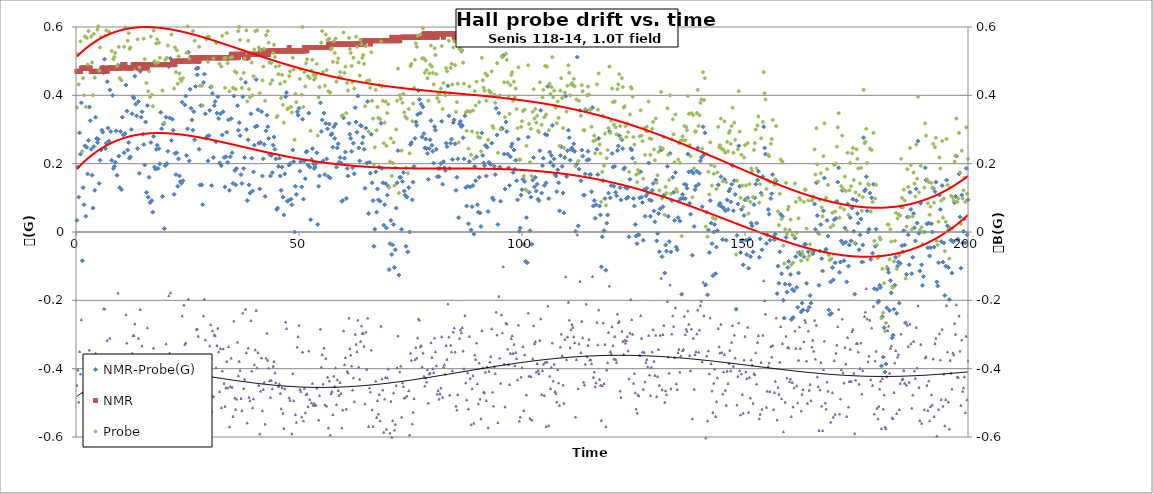
| Category | NMR-Probe(G) |
|---|---|
| 0.2 | 0.034 |
| 0.4 | 0.19 |
| 0.6000000000000001 | 0.102 |
| 0.8 | 0.29 |
| 1.0 | 0.228 |
| 1.2 | 0.378 |
| 1.4 | -0.084 |
| 1.5999999999999999 | 0.13 |
| 1.7999999999999998 | 0.08 |
| 1.9999999999999998 | 0.252 |
| 2.1999999999999997 | 0.046 |
| 2.4 | 0.248 |
| 2.6 | 0.17 |
| 2.8000000000000003 | 0.268 |
| 3.0000000000000004 | 0.366 |
| 3.2000000000000006 | 0.326 |
| 3.400000000000001 | 0.242 |
| 3.600000000000001 | 0.166 |
| 3.800000000000001 | 0.07 |
| 4.000000000000001 | 0.25 |
| 4.200000000000001 | 0.122 |
| 4.400000000000001 | 0.336 |
| 4.600000000000001 | 0.274 |
| 4.800000000000002 | 0.262 |
| 5.000000000000002 | 0.272 |
| 5.200000000000002 | 0.142 |
| 5.400000000000002 | 0.21 |
| 5.600000000000002 | 0.24 |
| 5.8000000000000025 | 0.298 |
| 6.000000000000003 | 0.292 |
| 6.200000000000003 | 0.466 |
| 6.400000000000003 | 0.506 |
| 6.600000000000003 | 0.244 |
| 6.800000000000003 | 0.26 |
| 7.0000000000000036 | 0.44 |
| 7.200000000000004 | 0.304 |
| 7.400000000000004 | 0.266 |
| 7.600000000000004 | 0.416 |
| 7.800000000000004 | 0.294 |
| 8.000000000000004 | 0.21 |
| 8.200000000000003 | 0.4 |
| 8.400000000000002 | 0.186 |
| 8.600000000000001 | 0.192 |
| 8.8 | 0.204 |
| 9.0 | 0.296 |
| 9.2 | 0.166 |
| 9.399999999999999 | 0.488 |
| 9.599999999999998 | 0.222 |
| 9.799999999999997 | 0.13 |
| 9.999999999999996 | 0.294 |
| 10.199999999999996 | 0.124 |
| 10.399999999999995 | 0.336 |
| 10.599999999999994 | 0.284 |
| 10.799999999999994 | 0.232 |
| 10.999999999999993 | 0.288 |
| 11.199999999999992 | 0.43 |
| 11.399999999999991 | 0.354 |
| 11.59999999999999 | 0.24 |
| 11.79999999999999 | 0.262 |
| 11.99999999999999 | 0.216 |
| 12.199999999999989 | 0.22 |
| 12.399999999999988 | 0.3 |
| 12.599999999999987 | 0.346 |
| 12.799999999999986 | 0.396 |
| 12.999999999999986 | 0.392 |
| 13.199999999999985 | 0.456 |
| 13.399999999999984 | 0.374 |
| 13.599999999999984 | 0.34 |
| 13.799999999999983 | 0.244 |
| 13.999999999999982 | 0.382 |
| 14.199999999999982 | 0.172 |
| 14.39999999999998 | 0.47 |
| 14.59999999999998 | 0.336 |
| 14.79999999999998 | 0.352 |
| 14.999999999999979 | 0.286 |
| 15.199999999999978 | 0.256 |
| 15.399999999999977 | 0.196 |
| 15.599999999999977 | 0.322 |
| 15.799999999999976 | 0.116 |
| 15.999999999999975 | 0.37 |
| 16.199999999999974 | 0.102 |
| 16.399999999999974 | 0.16 |
| 16.599999999999973 | 0.086 |
| 16.799999999999972 | 0.262 |
| 16.99999999999997 | 0.092 |
| 17.19999999999997 | 0.058 |
| 17.39999999999997 | 0.28 |
| 17.59999999999997 | 0.19 |
| 17.79999999999997 | 0.184 |
| 17.999999999999968 | 0.242 |
| 18.199999999999967 | 0.254 |
| 18.399999999999967 | 0.186 |
| 18.599999999999966 | 0.244 |
| 18.799999999999965 | 0.2 |
| 18.999999999999964 | 0.35 |
| 19.199999999999964 | 0.302 |
| 19.399999999999963 | 0.104 |
| 19.599999999999962 | 0.316 |
| 19.79999999999996 | 0.01 |
| 19.99999999999996 | 0.194 |
| 20.19999999999996 | 0.336 |
| 20.39999999999996 | 0.2 |
| 20.59999999999996 | 0.236 |
| 20.799999999999958 | 0.484 |
| 20.999999999999957 | 0.334 |
| 21.199999999999957 | 0.508 |
| 21.399999999999956 | 0.268 |
| 21.599999999999955 | 0.33 |
| 21.799999999999955 | 0.298 |
| 21.999999999999954 | 0.11 |
| 22.199999999999953 | 0.23 |
| 22.399999999999952 | 0.168 |
| 22.59999999999995 | 0.232 |
| 22.79999999999995 | 0.134 |
| 22.99999999999995 | 0.214 |
| 23.19999999999995 | 0.164 |
| 23.39999999999995 | 0.148 |
| 23.599999999999948 | 0.142 |
| 23.799999999999947 | 0.38 |
| 23.999999999999947 | 0.15 |
| 24.199999999999946 | 0.498 |
| 24.399999999999945 | 0.372 |
| 24.599999999999945 | 0.398 |
| 24.799999999999944 | 0.224 |
| 24.999999999999943 | 0.302 |
| 25.199999999999942 | 0.526 |
| 25.39999999999994 | 0.208 |
| 25.59999999999994 | 0.418 |
| 25.79999999999994 | 0.362 |
| 25.99999999999994 | 0.328 |
| 26.19999999999994 | 0.298 |
| 26.399999999999938 | 0.352 |
| 26.599999999999937 | 0.27 |
| 26.799999999999937 | 0.426 |
| 26.999999999999936 | 0.478 |
| 27.199999999999935 | 0.46 |
| 27.399999999999935 | 0.48 |
| 27.599999999999934 | 0.242 |
| 27.799999999999933 | 0.138 |
| 27.999999999999932 | 0.37 |
| 28.199999999999932 | 0.138 |
| 28.39999999999993 | 0.08 |
| 28.59999999999993 | 0.438 |
| 28.79999999999993 | 0.462 |
| 28.99999999999993 | 0.346 |
| 29.19999999999993 | 0.274 |
| 29.399999999999928 | 0.28 |
| 29.599999999999927 | 0.208 |
| 29.799999999999926 | 0.282 |
| 29.999999999999925 | 0.356 |
| 30.199999999999925 | 0.424 |
| 30.399999999999924 | 0.136 |
| 30.599999999999923 | 0.406 |
| 30.799999999999923 | 0.218 |
| 30.999999999999922 | 0.37 |
| 31.19999999999992 | 0.382 |
| 31.39999999999992 | 0.264 |
| 31.59999999999992 | 0.348 |
| 31.79999999999992 | 0.396 |
| 31.99999999999992 | 0.332 |
| 32.19999999999992 | 0.202 |
| 32.39999999999992 | 0.346 |
| 32.59999999999992 | 0.194 |
| 32.799999999999926 | 0.284 |
| 32.99999999999993 | 0.352 |
| 33.19999999999993 | 0.218 |
| 33.399999999999935 | 0.132 |
| 33.59999999999994 | 0.22 |
| 33.79999999999994 | 0.292 |
| 33.99999999999994 | 0.204 |
| 34.199999999999946 | 0.328 |
| 34.39999999999995 | 0.122 |
| 34.59999999999995 | 0.22 |
| 34.799999999999955 | 0.332 |
| 34.99999999999996 | 0.232 |
| 35.19999999999996 | 0.142 |
| 35.39999999999996 | 0.398 |
| 35.599999999999966 | 0.18 |
| 35.79999999999997 | 0.138 |
| 35.99999999999997 | 0.186 |
| 36.199999999999974 | 0.37 |
| 36.39999999999998 | 0.298 |
| 36.59999999999998 | 0.32 |
| 36.79999999999998 | 0.282 |
| 36.999999999999986 | 0.168 |
| 37.19999999999999 | 0.142 |
| 37.39999999999999 | 0.396 |
| 37.599999999999994 | 0.186 |
| 37.8 | 0.218 |
| 38.0 | 0.438 |
| 38.2 | 0.3 |
| 38.400000000000006 | 0.092 |
| 38.60000000000001 | 0.27 |
| 38.80000000000001 | 0.138 |
| 39.000000000000014 | 0.114 |
| 39.20000000000002 | 0.346 |
| 39.40000000000002 | 0.216 |
| 39.60000000000002 | 0.12 |
| 39.800000000000026 | 0.176 |
| 40.00000000000003 | 0.254 |
| 40.20000000000003 | 0.308 |
| 40.400000000000034 | 0.446 |
| 40.60000000000004 | 0.31 |
| 40.80000000000004 | 0.358 |
| 41.00000000000004 | 0.26 |
| 41.200000000000045 | 0.126 |
| 41.40000000000005 | 0.262 |
| 41.60000000000005 | 0.352 |
| 41.800000000000054 | 0.164 |
| 42.00000000000006 | 0.214 |
| 42.20000000000006 | 0.256 |
| 42.40000000000006 | 0.104 |
| 42.600000000000065 | 0.296 |
| 42.80000000000007 | 0.342 |
| 43.00000000000007 | 0.308 |
| 43.200000000000074 | 0.274 |
| 43.40000000000008 | 0.226 |
| 43.60000000000008 | 0.164 |
| 43.80000000000008 | 0.224 |
| 44.000000000000085 | 0.174 |
| 44.20000000000009 | 0.254 |
| 44.40000000000009 | 0.278 |
| 44.600000000000094 | 0.242 |
| 44.8000000000001 | 0.214 |
| 45.0000000000001 | 0.066 |
| 45.2000000000001 | 0.07 |
| 45.400000000000105 | 0.192 |
| 45.60000000000011 | 0.216 |
| 45.80000000000011 | 0.164 |
| 46.000000000000114 | 0.122 |
| 46.20000000000012 | 0.19 |
| 46.40000000000012 | 0.102 |
| 46.60000000000012 | 0.05 |
| 46.800000000000125 | 0.17 |
| 47.00000000000013 | 0.396 |
| 47.20000000000013 | 0.408 |
| 47.400000000000134 | 0.09 |
| 47.600000000000136 | 0.092 |
| 47.80000000000014 | 0.196 |
| 48.00000000000014 | 0.2 |
| 48.200000000000145 | 0.096 |
| 48.40000000000015 | 0.08 |
| 48.60000000000015 | 0.24 |
| 48.80000000000015 | 0.206 |
| 49.000000000000156 | 0 |
| 49.20000000000016 | 0.134 |
| 49.40000000000016 | 0.11 |
| 49.600000000000165 | 0.352 |
| 49.80000000000017 | 0.342 |
| 50.00000000000017 | 0.362 |
| 50.20000000000017 | 0.178 |
| 50.400000000000176 | 0.206 |
| 50.60000000000018 | 0.132 |
| 50.80000000000018 | 0.33 |
| 51.000000000000185 | 0.096 |
| 51.20000000000019 | 0.208 |
| 51.40000000000019 | 0.156 |
| 51.60000000000019 | 0.234 |
| 51.800000000000196 | 0.236 |
| 52.0000000000002 | 0.196 |
| 52.2000000000002 | 0.348 |
| 52.400000000000205 | 0.19 |
| 52.60000000000021 | 0.036 |
| 52.80000000000021 | 0.212 |
| 53.00000000000021 | 0.244 |
| 53.200000000000216 | 0.2 |
| 53.40000000000022 | 0.186 |
| 53.60000000000022 | 0.19 |
| 53.800000000000225 | 0.2 |
| 54.00000000000023 | 0.232 |
| 54.20000000000023 | 0.022 |
| 54.40000000000023 | 0.134 |
| 54.600000000000236 | 0.164 |
| 54.80000000000024 | 0.378 |
| 55.00000000000024 | 0.294 |
| 55.200000000000244 | 0.328 |
| 55.40000000000025 | 0.208 |
| 55.60000000000025 | 0.348 |
| 55.80000000000025 | 0.168 |
| 56.000000000000256 | 0.318 |
| 56.20000000000026 | 0.214 |
| 56.40000000000026 | 0.302 |
| 56.600000000000264 | 0.162 |
| 56.80000000000027 | 0.316 |
| 57.00000000000027 | 0.158 |
| 57.20000000000027 | 0.284 |
| 57.400000000000276 | 0.288 |
| 57.60000000000028 | 0.248 |
| 57.80000000000028 | 0.308 |
| 58.000000000000284 | 0.274 |
| 58.20000000000029 | 0.316 |
| 58.40000000000029 | 0.19 |
| 58.60000000000029 | 0.246 |
| 58.800000000000296 | 0.258 |
| 59.0000000000003 | 0.204 |
| 59.2000000000003 | 0.218 |
| 59.400000000000304 | 0.202 |
| 59.60000000000031 | 0.09 |
| 59.80000000000031 | 0.092 |
| 60.00000000000031 | 0.334 |
| 60.200000000000315 | 0.216 |
| 60.40000000000032 | 0.234 |
| 60.60000000000032 | 0.098 |
| 60.800000000000324 | 0.186 |
| 61.00000000000033 | 0.164 |
| 61.20000000000033 | 0.318 |
| 61.40000000000033 | 0.286 |
| 61.600000000000335 | 0.274 |
| 61.80000000000034 | 0.236 |
| 62.00000000000034 | 0.188 |
| 62.200000000000344 | 0.26 |
| 62.40000000000035 | 0.17 |
| 62.60000000000035 | 0.364 |
| 62.80000000000035 | 0.322 |
| 63.000000000000355 | 0.292 |
| 63.20000000000036 | 0.398 |
| 63.40000000000036 | 0.246 |
| 63.600000000000364 | 0.208 |
| 63.80000000000037 | 0.312 |
| 64.00000000000037 | 0.31 |
| 64.20000000000037 | 0.26 |
| 64.40000000000038 | 0.278 |
| 64.60000000000038 | 0.242 |
| 64.80000000000038 | 0.128 |
| 65.00000000000038 | 0.304 |
| 65.20000000000039 | 0.202 |
| 65.40000000000039 | 0.382 |
| 65.60000000000039 | 0.054 |
| 65.8000000000004 | 0.204 |
| 66.0000000000004 | 0.172 |
| 66.2000000000004 | 0.286 |
| 66.4000000000004 | 0.144 |
| 66.6000000000004 | 0.092 |
| 66.80000000000041 | -0.042 |
| 67.00000000000041 | 0.008 |
| 67.20000000000041 | 0.176 |
| 67.40000000000042 | 0.058 |
| 67.60000000000042 | 0.126 |
| 67.80000000000042 | 0.094 |
| 68.00000000000043 | 0.19 |
| 68.20000000000043 | 0.09 |
| 68.40000000000043 | 0.318 |
| 68.60000000000043 | 0.186 |
| 68.80000000000044 | 0.144 |
| 69.00000000000044 | 0.02 |
| 69.20000000000044 | 0.08 |
| 69.40000000000045 | 0.142 |
| 69.60000000000045 | 0.012 |
| 69.80000000000045 | 0.108 |
| 70.00000000000045 | 0.134 |
| 70.20000000000046 | -0.11 |
| 70.40000000000046 | -0.034 |
| 70.60000000000046 | 0.034 |
| 70.80000000000047 | -0.066 |
| 71.00000000000047 | -0.038 |
| 71.20000000000047 | 0.022 |
| 71.40000000000047 | -0.104 |
| 71.60000000000048 | -0.052 |
| 71.80000000000048 | 0.07 |
| 72.00000000000048 | 0.144 |
| 72.20000000000049 | 0.238 |
| 72.40000000000049 | -0.126 |
| 72.60000000000049 | 0.16 |
| 72.8000000000005 | 0.16 |
| 73.0000000000005 | 0.008 |
| 73.2000000000005 | 0.148 |
| 73.4000000000005 | 0.174 |
| 73.6000000000005 | 0.12 |
| 73.80000000000051 | 0.108 |
| 74.00000000000051 | -0.042 |
| 74.20000000000051 | 0.102 |
| 74.40000000000052 | -0.058 |
| 74.60000000000052 | 0.13 |
| 74.80000000000052 | 0 |
| 75.00000000000053 | 0.256 |
| 75.20000000000053 | 0.262 |
| 75.40000000000053 | 0.094 |
| 75.60000000000053 | 0.146 |
| 75.80000000000054 | 0.192 |
| 76.00000000000054 | 0.274 |
| 76.20000000000054 | 0.322 |
| 76.40000000000055 | 0.312 |
| 76.60000000000055 | 0.344 |
| 76.80000000000055 | 0.414 |
| 77.00000000000055 | 0.388 |
| 77.20000000000056 | 0.348 |
| 77.40000000000056 | 0.374 |
| 77.60000000000056 | 0.278 |
| 77.80000000000057 | 0.366 |
| 78.00000000000057 | 0.288 |
| 78.20000000000057 | 0.246 |
| 78.40000000000057 | 0.272 |
| 78.60000000000058 | 0.244 |
| 78.80000000000058 | 0.23 |
| 79.00000000000058 | 0.154 |
| 79.20000000000059 | 0.244 |
| 79.40000000000059 | 0.27 |
| 79.60000000000059 | 0.326 |
| 79.8000000000006 | 0.254 |
| 80.0000000000006 | 0.236 |
| 80.2000000000006 | 0.202 |
| 80.4000000000006 | 0.308 |
| 80.6000000000006 | 0.298 |
| 80.80000000000061 | 0.242 |
| 81.00000000000061 | 0.162 |
| 81.20000000000061 | 0.186 |
| 81.40000000000062 | 0.162 |
| 81.60000000000062 | 0.186 |
| 81.80000000000062 | 0.2 |
| 82.00000000000063 | 0.324 |
| 82.20000000000063 | 0.14 |
| 82.40000000000063 | 0.206 |
| 82.60000000000063 | 0.188 |
| 82.80000000000064 | 0.18 |
| 83.00000000000064 | 0.26 |
| 83.20000000000064 | 0.25 |
| 83.40000000000065 | 0.428 |
| 83.60000000000065 | 0.34 |
| 83.80000000000065 | 0.186 |
| 84.00000000000065 | 0.26 |
| 84.20000000000066 | 0.272 |
| 84.40000000000066 | 0.212 |
| 84.60000000000066 | 0.32 |
| 84.80000000000067 | 0.328 |
| 85.00000000000067 | 0.258 |
| 85.20000000000067 | 0.122 |
| 85.40000000000067 | 0.16 |
| 85.60000000000068 | 0.214 |
| 85.80000000000068 | 0.042 |
| 86.00000000000068 | 0.316 |
| 86.20000000000068 | 0.324 |
| 86.40000000000069 | 0.308 |
| 86.60000000000069 | 0.312 |
| 86.8000000000007 | 0.276 |
| 87.0000000000007 | 0.214 |
| 87.2000000000007 | 0.34 |
| 87.4000000000007 | 0.13 |
| 87.6000000000007 | 0.076 |
| 87.80000000000071 | 0.134 |
| 88.00000000000071 | 0.024 |
| 88.20000000000071 | 0.206 |
| 88.40000000000072 | 0.132 |
| 88.60000000000072 | 0.006 |
| 88.80000000000072 | 0.074 |
| 89.00000000000072 | 0.136 |
| 89.20000000000073 | -0.006 |
| 89.40000000000073 | 0.192 |
| 89.60000000000073 | 0.15 |
| 89.80000000000074 | 0.22 |
| 90.00000000000074 | 0.08 |
| 90.20000000000074 | 0.058 |
| 90.40000000000074 | 0.16 |
| 90.60000000000075 | 0.056 |
| 90.80000000000075 | 0.016 |
| 91.00000000000075 | 0.29 |
| 91.20000000000076 | 0.224 |
| 91.40000000000076 | 0.202 |
| 91.60000000000076 | 0.194 |
| 91.80000000000076 | 0.254 |
| 92.00000000000077 | 0.164 |
| 92.20000000000077 | 0.248 |
| 92.40000000000077 | 0.06 |
| 92.60000000000078 | 0.204 |
| 92.80000000000078 | 0.2 |
| 93.00000000000078 | 0.198 |
| 93.20000000000078 | 0.26 |
| 93.40000000000079 | 0.1 |
| 93.60000000000079 | 0.094 |
| 93.8000000000008 | 0.192 |
| 94.0000000000008 | 0.168 |
| 94.2000000000008 | 0.362 |
| 94.4000000000008 | 0.284 |
| 94.6000000000008 | 0.022 |
| 94.80000000000081 | 0.348 |
| 95.00000000000081 | 0.19 |
| 95.20000000000081 | 0.09 |
| 95.40000000000082 | 0.304 |
| 95.60000000000082 | 0.302 |
| 95.80000000000082 | 0.516 |
| 96.00000000000082 | 0.228 |
| 96.20000000000083 | 0.126 |
| 96.40000000000083 | 0.322 |
| 96.60000000000083 | 0.294 |
| 96.80000000000084 | 0.228 |
| 97.00000000000084 | 0.188 |
| 97.20000000000084 | 0.136 |
| 97.40000000000084 | 0.22 |
| 97.60000000000085 | 0.25 |
| 97.80000000000085 | 0.258 |
| 98.00000000000085 | 0.174 |
| 98.20000000000086 | 0.24 |
| 98.40000000000086 | 0.184 |
| 98.60000000000086 | 0.21 |
| 98.80000000000086 | 0.15 |
| 99.00000000000087 | 0.094 |
| 99.20000000000087 | 0.272 |
| 99.40000000000087 | 0.002 |
| 99.60000000000088 | 0.012 |
| 99.80000000000088 | 0.108 |
| 100.00000000000088 | 0.124 |
| 100.20000000000088 | 0.154 |
| 100.40000000000089 | -0.036 |
| 100.60000000000089 | 0.148 |
| 100.80000000000089 | -0.086 |
| 101.0000000000009 | 0.042 |
| 101.2000000000009 | -0.09 |
| 101.4000000000009 | 0.278 |
| 101.6000000000009 | 0.116 |
| 101.8000000000009 | 0.004 |
| 102.00000000000091 | 0.102 |
| 102.20000000000091 | -0.036 |
| 102.40000000000092 | 0.152 |
| 102.60000000000092 | 0.218 |
| 102.80000000000092 | 0.132 |
| 103.00000000000092 | 0.16 |
| 103.20000000000093 | 0.12 |
| 103.40000000000093 | 0.14 |
| 103.60000000000093 | 0.096 |
| 103.80000000000094 | 0.092 |
| 104.00000000000094 | 0.238 |
| 104.20000000000094 | 0.356 |
| 104.40000000000094 | 0.114 |
| 104.60000000000095 | 0.194 |
| 104.80000000000095 | 0.216 |
| 105.00000000000095 | 0.136 |
| 105.20000000000095 | 0.286 |
| 105.40000000000096 | 0.144 |
| 105.60000000000096 | 0.284 |
| 105.80000000000096 | 0.426 |
| 106.00000000000097 | 0.098 |
| 106.20000000000097 | 0.234 |
| 106.40000000000097 | 0.204 |
| 106.60000000000097 | 0.224 |
| 106.80000000000098 | 0.312 |
| 107.00000000000098 | 0.194 |
| 107.20000000000098 | 0.214 |
| 107.40000000000099 | 0.168 |
| 107.60000000000099 | 0.164 |
| 107.80000000000099 | 0.118 |
| 108.000000000001 | 0.182 |
| 108.200000000001 | 0.144 |
| 108.400000000001 | 0.062 |
| 108.600000000001 | 0.224 |
| 108.800000000001 | 0.25 |
| 109.00000000000101 | 0.192 |
| 109.20000000000101 | 0.114 |
| 109.40000000000101 | 0.056 |
| 109.60000000000102 | 0.218 |
| 109.80000000000102 | 0.398 |
| 110.00000000000102 | 0.162 |
| 110.20000000000103 | 0.238 |
| 110.40000000000103 | 0.298 |
| 110.60000000000103 | 0.276 |
| 110.80000000000103 | 0.21 |
| 111.00000000000104 | 0.242 |
| 111.20000000000104 | 0.246 |
| 111.40000000000104 | 0.24 |
| 111.60000000000105 | 0.258 |
| 111.80000000000105 | 0.236 |
| 112.00000000000105 | 0.002 |
| 112.20000000000105 | 0.198 |
| 112.40000000000106 | 0.512 |
| 112.60000000000106 | 0.018 |
| 112.80000000000106 | 0.184 |
| 113.00000000000107 | 0.356 |
| 113.20000000000107 | 0.15 |
| 113.40000000000107 | 0.24 |
| 113.60000000000107 | 0.222 |
| 113.80000000000108 | 0.108 |
| 114.00000000000108 | 0.108 |
| 114.20000000000108 | 0.17 |
| 114.40000000000109 | 0.356 |
| 114.60000000000109 | 0.21 |
| 114.80000000000109 | 0.236 |
| 115.0000000000011 | 0.212 |
| 115.2000000000011 | 0.168 |
| 115.4000000000011 | 0.168 |
| 115.6000000000011 | 0.118 |
| 115.8000000000011 | 0.364 |
| 116.00000000000111 | 0.076 |
| 116.20000000000111 | 0.092 |
| 116.40000000000111 | 0.04 |
| 116.60000000000112 | 0.08 |
| 116.80000000000112 | 0.242 |
| 117.00000000000112 | 0.168 |
| 117.20000000000113 | 0.274 |
| 117.40000000000113 | 0.076 |
| 117.60000000000113 | 0.05 |
| 117.80000000000113 | -0.102 |
| 118.00000000000114 | -0.014 |
| 118.20000000000114 | 0.15 |
| 118.40000000000114 | 0.004 |
| 118.60000000000115 | 0.098 |
| 118.80000000000115 | -0.112 |
| 119.00000000000115 | 0.026 |
| 119.20000000000115 | 0.05 |
| 119.40000000000116 | 0.114 |
| 119.60000000000116 | 0.294 |
| 119.80000000000116 | 0.1 |
| 120.00000000000117 | 0.136 |
| 120.20000000000117 | 0.23 |
| 120.40000000000117 | 0.19 |
| 120.60000000000117 | 0.134 |
| 120.80000000000118 | 0.192 |
| 121.00000000000118 | 0.116 |
| 121.20000000000118 | 0.106 |
| 121.40000000000119 | 0.238 |
| 121.60000000000119 | 0.252 |
| 121.80000000000119 | 0.282 |
| 122.0000000000012 | 0.13 |
| 122.2000000000012 | 0.094 |
| 122.4000000000012 | 0.27 |
| 122.6000000000012 | 0.244 |
| 122.8000000000012 | 0.184 |
| 123.00000000000121 | 0.188 |
| 123.20000000000121 | 0.13 |
| 123.40000000000121 | 0.098 |
| 123.60000000000122 | 0.128 |
| 123.80000000000122 | 0.102 |
| 124.00000000000122 | -0.014 |
| 124.20000000000122 | 0.154 |
| 124.40000000000123 | 0.244 |
| 124.60000000000123 | 0.24 |
| 124.80000000000123 | 0.216 |
| 125.00000000000124 | 0.098 |
| 125.20000000000124 | 0.076 |
| 125.40000000000124 | 0.022 |
| 125.60000000000124 | -0.012 |
| 125.80000000000125 | -0.034 |
| 126.00000000000125 | -0.008 |
| 126.20000000000125 | -0.008 |
| 126.40000000000126 | 0.1 |
| 126.60000000000126 | 0.176 |
| 126.80000000000126 | 0.102 |
| 127.00000000000126 | 0.086 |
| 127.20000000000127 | -0.024 |
| 127.40000000000127 | 0.124 |
| 127.60000000000127 | 0.046 |
| 127.80000000000128 | 0.106 |
| 128.00000000000128 | 0.128 |
| 128.20000000000127 | 0.114 |
| 128.40000000000126 | 0.202 |
| 128.60000000000124 | 0.094 |
| 128.80000000000123 | 0.046 |
| 129.00000000000122 | 0.092 |
| 129.2000000000012 | 0.122 |
| 129.4000000000012 | 0.142 |
| 129.6000000000012 | 0.062 |
| 129.80000000000118 | 0.03 |
| 130.00000000000117 | 0.152 |
| 130.20000000000115 | -0.026 |
| 130.40000000000114 | -0.004 |
| 130.60000000000113 | 0.054 |
| 130.80000000000112 | -0.058 |
| 131.0000000000011 | 0.068 |
| 131.2000000000011 | 0.24 |
| 131.40000000000109 | -0.072 |
| 131.60000000000107 | 0.074 |
| 131.80000000000106 | 0.108 |
| 132.00000000000105 | -0.12 |
| 132.20000000000104 | -0.038 |
| 132.40000000000103 | -0.056 |
| 132.60000000000102 | 0.192 |
| 132.800000000001 | 0.046 |
| 133.000000000001 | -0.028 |
| 133.20000000000098 | 0.23 |
| 133.40000000000097 | -0.058 |
| 133.60000000000096 | 0.092 |
| 133.80000000000095 | 0.16 |
| 134.00000000000094 | 0.116 |
| 134.20000000000093 | 0.034 |
| 134.40000000000092 | 0.174 |
| 134.6000000000009 | -0.044 |
| 134.8000000000009 | -0.052 |
| 135.00000000000088 | 0.042 |
| 135.20000000000087 | 0.09 |
| 135.40000000000086 | 0.032 |
| 135.60000000000085 | 0.098 |
| 135.80000000000084 | -0.182 |
| 136.00000000000082 | 0.11 |
| 136.2000000000008 | 0.098 |
| 136.4000000000008 | 0.14 |
| 136.6000000000008 | 0.098 |
| 136.80000000000078 | 0.138 |
| 137.00000000000077 | 0.128 |
| 137.20000000000076 | 0.228 |
| 137.40000000000074 | 0.176 |
| 137.60000000000073 | 0.084 |
| 137.80000000000072 | 0.052 |
| 138.0000000000007 | 0.178 |
| 138.2000000000007 | -0.068 |
| 138.4000000000007 | 0.172 |
| 138.60000000000068 | 0.016 |
| 138.80000000000067 | 0.124 |
| 139.00000000000065 | 0.134 |
| 139.20000000000064 | 0.178 |
| 139.40000000000063 | 0.246 |
| 139.60000000000062 | 0.14 |
| 139.8000000000006 | 0.172 |
| 140.0000000000006 | 0.208 |
| 140.20000000000059 | 0.218 |
| 140.40000000000057 | 0.074 |
| 140.60000000000056 | 0.308 |
| 140.80000000000055 | 0.226 |
| 141.00000000000054 | 0.29 |
| 141.20000000000053 | -0.154 |
| 141.40000000000052 | 0.058 |
| 141.6000000000005 | -0.184 |
| 141.8000000000005 | 0.006 |
| 142.00000000000048 | -0.06 |
| 142.20000000000047 | 0.092 |
| 142.40000000000046 | 0.026 |
| 142.60000000000045 | -0.034 |
| 142.80000000000044 | -0.128 |
| 143.00000000000043 | 0 |
| 143.20000000000041 | 0.022 |
| 143.4000000000004 | -0.122 |
| 143.6000000000004 | -0.044 |
| 143.80000000000038 | 0.004 |
| 144.00000000000037 | 0.138 |
| 144.20000000000036 | 0.078 |
| 144.40000000000035 | 0.084 |
| 144.60000000000034 | 0.162 |
| 144.80000000000032 | 0.074 |
| 145.0000000000003 | -0.022 |
| 145.2000000000003 | 0.07 |
| 145.4000000000003 | 0.154 |
| 145.60000000000028 | 0.062 |
| 145.80000000000027 | -0.024 |
| 146.00000000000026 | 0.094 |
| 146.20000000000024 | 0.066 |
| 146.40000000000023 | 0.12 |
| 146.60000000000022 | 0.126 |
| 146.8000000000002 | 0.088 |
| 147.0000000000002 | 0.14 |
| 147.2000000000002 | 0.194 |
| 147.40000000000018 | 0.062 |
| 147.60000000000016 | 0.15 |
| 147.80000000000015 | 0.11 |
| 148.00000000000014 | -0.226 |
| 148.20000000000013 | -0.01 |
| 148.40000000000012 | 0.082 |
| 148.6000000000001 | 0.252 |
| 148.8000000000001 | 0.134 |
| 149.00000000000009 | -0.06 |
| 149.20000000000007 | 0.066 |
| 149.40000000000006 | -0.024 |
| 149.60000000000005 | -0.096 |
| 149.80000000000004 | 0.048 |
| 150.00000000000003 | 0.094 |
| 150.20000000000002 | -0.024 |
| 150.4 | -0.066 |
| 150.6 | 0.1 |
| 150.79999999999998 | -0.106 |
| 150.99999999999997 | -0.02 |
| 151.19999999999996 | -0.072 |
| 151.39999999999995 | 0.026 |
| 151.59999999999994 | 0.018 |
| 151.79999999999993 | -0.058 |
| 151.99999999999991 | 0.08 |
| 152.1999999999999 | 0.1 |
| 152.3999999999999 | 0.14 |
| 152.59999999999988 | 0.026 |
| 152.79999999999987 | 0.152 |
| 152.99999999999986 | 0.178 |
| 153.19999999999985 | -0.074 |
| 153.39999999999984 | -0.02 |
| 153.59999999999982 | 0.114 |
| 153.7999999999998 | -0.052 |
| 153.9999999999998 | 0.162 |
| 154.1999999999998 | 0.308 |
| 154.39999999999978 | 0.246 |
| 154.59999999999977 | 0.228 |
| 154.79999999999976 | -0.034 |
| 154.99999999999974 | -0.008 |
| 155.19999999999973 | 0.066 |
| 155.39999999999972 | 0.052 |
| 155.5999999999997 | -0.024 |
| 155.7999999999997 | 0.098 |
| 155.9999999999997 | 0.112 |
| 156.19999999999968 | 0.168 |
| 156.39999999999966 | -0.014 |
| 156.59999999999965 | -0.022 |
| 156.79999999999964 | -0.006 |
| 156.99999999999963 | 0.15 |
| 157.19999999999962 | -0.18 |
| 157.3999999999996 | -0.1 |
| 157.5999999999996 | -0.15 |
| 157.79999999999959 | -0.058 |
| 157.99999999999957 | 0.052 |
| 158.19999999999956 | -0.122 |
| 158.39999999999955 | 0.046 |
| 158.59999999999954 | -0.2 |
| 158.79999999999953 | -0.252 |
| 158.99999999999952 | -0.152 |
| 159.1999999999995 | -0.016 |
| 159.3999999999995 | -0.176 |
| 159.59999999999948 | -0.104 |
| 159.79999999999947 | -0.086 |
| 159.99999999999946 | -0.154 |
| 160.19999999999945 | -0.124 |
| 160.39999999999944 | -0.256 |
| 160.59999999999943 | -0.168 |
| 160.79999999999941 | -0.25 |
| 160.9999999999994 | -0.172 |
| 161.1999999999994 | -0.018 |
| 161.39999999999938 | -0.072 |
| 161.59999999999937 | -0.162 |
| 161.79999999999936 | -0.22 |
| 161.99999999999935 | -0.12 |
| 162.19999999999933 | -0.06 |
| 162.39999999999932 | -0.066 |
| 162.5999999999993 | -0.234 |
| 162.7999999999993 | -0.208 |
| 162.9999999999993 | -0.228 |
| 163.19999999999928 | -0.072 |
| 163.39999999999927 | -0.036 |
| 163.59999999999926 | -0.036 |
| 163.79999999999924 | -0.15 |
| 163.99999999999923 | -0.23 |
| 164.19999999999922 | -0.058 |
| 164.3999999999992 | -0.22 |
| 164.5999999999992 | -0.186 |
| 164.7999999999992 | -0.208 |
| 164.99999999999918 | -0.058 |
| 165.19999999999916 | -0.064 |
| 165.39999999999915 | -0.056 |
| 165.59999999999914 | 0.082 |
| 165.79999999999913 | 0.008 |
| 165.99999999999912 | 0.144 |
| 166.1999999999991 | 0.048 |
| 166.3999999999991 | -0.002 |
| 166.59999999999908 | -0.156 |
| 166.79999999999907 | -0.056 |
| 166.99999999999906 | 0.022 |
| 167.19999999999905 | -0.078 |
| 167.39999999999904 | -0.114 |
| 167.59999999999903 | 0.062 |
| 167.79999999999902 | 0.158 |
| 167.999999999999 | -0.056 |
| 168.199999999999 | -0.05 |
| 168.39999999999898 | 0.034 |
| 168.59999999999897 | -0.012 |
| 168.79999999999896 | -0.228 |
| 168.99999999999895 | -0.242 |
| 169.19999999999894 | -0.146 |
| 169.39999999999893 | -0.238 |
| 169.59999999999891 | -0.104 |
| 169.7999999999989 | -0.14 |
| 169.9999999999989 | 0.036 |
| 170.19999999999888 | -0.09 |
| 170.39999999999887 | 0.04 |
| 170.59999999999886 | 0.09 |
| 170.79999999999885 | 0.146 |
| 170.99999999999883 | 0.188 |
| 171.19999999999882 | -0.118 |
| 171.3999999999988 | -0.088 |
| 171.5999999999988 | -0.026 |
| 171.7999999999988 | 0.122 |
| 171.99999999999878 | -0.034 |
| 172.19999999999877 | -0.084 |
| 172.39999999999876 | 0.012 |
| 172.59999999999874 | -0.03 |
| 172.79999999999873 | -0.146 |
| 172.99999999999872 | 0.082 |
| 173.1999999999987 | -0.1 |
| 173.3999999999987 | -0.038 |
| 173.5999999999987 | 0.042 |
| 173.79999999999868 | -0.026 |
| 173.99999999999866 | 0.07 |
| 174.19999999999865 | 0.096 |
| 174.39999999999864 | 0.002 |
| 174.59999999999863 | -0.182 |
| 174.79999999999862 | -0.034 |
| 174.9999999999986 | 0.092 |
| 175.1999999999986 | 0.054 |
| 175.39999999999858 | 0.026 |
| 175.59999999999857 | -0.052 |
| 175.79999999999856 | -0.008 |
| 175.99999999999855 | 0.038 |
| 176.19999999999854 | -0.088 |
| 176.39999999999853 | -0.038 |
| 176.59999999999852 | 0.276 |
| 176.7999999999985 | 0.12 |
| 176.9999999999985 | 0.124 |
| 177.19999999999848 | 0.162 |
| 177.39999999999847 | 0.062 |
| 177.59999999999846 | 0 |
| 177.79999999999845 | 0.008 |
| 177.99999999999844 | 0.114 |
| 178.19999999999843 | -0.08 |
| 178.3999999999984 | 0.1 |
| 178.5999999999984 | -0.062 |
| 178.7999999999984 | 0.14 |
| 178.99999999999838 | -0.166 |
| 179.19999999999837 | -0.042 |
| 179.39999999999836 | 0.008 |
| 179.59999999999835 | -0.168 |
| 179.79999999999833 | -0.206 |
| 179.99999999999832 | -0.202 |
| 180.1999999999983 | -0.156 |
| 180.3999999999983 | -0.162 |
| 180.5999999999983 | -0.392 |
| 180.79999999999828 | -0.248 |
| 180.99999999999827 | -0.366 |
| 181.19999999999825 | -0.28 |
| 181.39999999999824 | -0.41 |
| 181.59999999999823 | -0.386 |
| 181.79999999999822 | -0.222 |
| 181.9999999999982 | -0.108 |
| 182.1999999999982 | -0.118 |
| 182.3999999999982 | -0.23 |
| 182.59999999999818 | -0.142 |
| 182.79999999999816 | -0.178 |
| 182.99999999999815 | -0.31 |
| 183.19999999999814 | -0.302 |
| 183.39999999999813 | -0.226 |
| 183.59999999999812 | -0.156 |
| 183.7999999999981 | -0.074 |
| 183.9999999999981 | -0.238 |
| 184.19999999999808 | -0.1 |
| 184.39999999999807 | -0.088 |
| 184.59999999999806 | -0.208 |
| 184.79999999999805 | -0.092 |
| 184.99999999999804 | 0.074 |
| 185.19999999999803 | -0.04 |
| 185.39999999999802 | -0.058 |
| 185.599999999998 | 0.004 |
| 185.799999999998 | -0.038 |
| 185.99999999999798 | -0.266 |
| 186.19999999999797 | -0.124 |
| 186.39999999999796 | 0.044 |
| 186.59999999999795 | -0.008 |
| 186.79999999999794 | -0.096 |
| 186.99999999999793 | 0.116 |
| 187.1999999999979 | 0.066 |
| 187.3999999999979 | -0.122 |
| 187.5999999999979 | -0.074 |
| 187.79999999999788 | 0.054 |
| 187.99999999999787 | 0.012 |
| 188.19999999999786 | -0.026 |
| 188.39999999999785 | 0.126 |
| 188.59999999999783 | 0.026 |
| 188.79999999999782 | 0.266 |
| 188.9999999999978 | -0.004 |
| 189.1999999999978 | -0.114 |
| 189.3999999999978 | 0.084 |
| 189.59999999999778 | -0.096 |
| 189.79999999999777 | -0.156 |
| 189.99999999999775 | -0.13 |
| 190.19999999999774 | 0 |
| 190.39999999999773 | 0.188 |
| 190.59999999999772 | 0.152 |
| 190.7999999999977 | 0.024 |
| 190.9999999999977 | -0.046 |
| 191.1999999999977 | 0.026 |
| 191.39999999999768 | -0.07 |
| 191.59999999999766 | -0.046 |
| 191.79999999999765 | 0.024 |
| 191.99999999999764 | 0 |
| 192.19999999999763 | 0.128 |
| 192.39999999999762 | -0.044 |
| 192.5999999999976 | 0.118 |
| 192.7999999999976 | 0.146 |
| 192.99999999999758 | -0.146 |
| 193.19999999999757 | -0.158 |
| 193.39999999999756 | -0.09 |
| 193.59999999999755 | 0.108 |
| 193.79999999999754 | 0.066 |
| 193.99999999999753 | -0.028 |
| 194.19999999999752 | 0.136 |
| 194.3999999999975 | -0.088 |
| 194.5999999999975 | -0.032 |
| 194.79999999999748 | -0.186 |
| 194.99999999999747 | -0.1 |
| 195.19999999999746 | 0.152 |
| 195.39999999999745 | 0.018 |
| 195.59999999999744 | -0.104 |
| 195.79999999999742 | -0.198 |
| 195.9999999999974 | 0.01 |
| 196.1999999999974 | -0.024 |
| 196.3999999999974 | -0.12 |
| 196.59999999999738 | -0.028 |
| 196.79999999999737 | -0.028 |
| 196.99999999999736 | 0.086 |
| 197.19999999999735 | 0.104 |
| 197.39999999999733 | 0.222 |
| 197.59999999999732 | -0.022 |
| 197.7999999999973 | -0.022 |
| 197.9999999999973 | 0.17 |
| 198.1999999999973 | 0.044 |
| 198.39999999999728 | -0.106 |
| 198.59999999999727 | 0.108 |
| 198.79999999999725 | -0.032 |
| 198.99999999999724 | 0.002 |
| 199.19999999999723 | 0.038 |
| 199.39999999999722 | -0.032 |
| 199.5999999999972 | 0.186 |
| 199.7999999999972 | -0.008 |
| 199.9999999999972 | 0.094 |